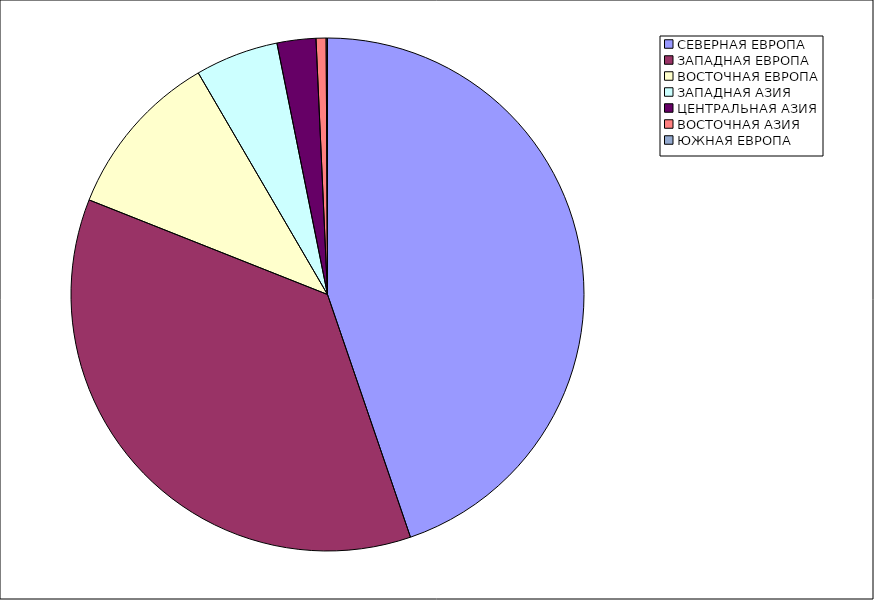
| Category | Оборот |
|---|---|
| СЕВЕРНАЯ ЕВРОПА | 44.756 |
| ЗАПАДНАЯ ЕВРОПА | 36.254 |
| ВОСТОЧНАЯ ЕВРОПА | 10.586 |
| ЗАПАДНАЯ АЗИЯ | 5.243 |
| ЦЕНТРАЛЬНАЯ АЗИЯ | 2.445 |
| ВОСТОЧНАЯ АЗИЯ | 0.632 |
| ЮЖНАЯ ЕВРОПА | 0.084 |